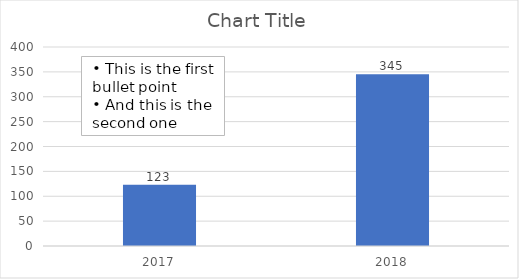
| Category | Series 0 |
|---|---|
| 2017.0 | 123 |
| 2018.0 | 345 |